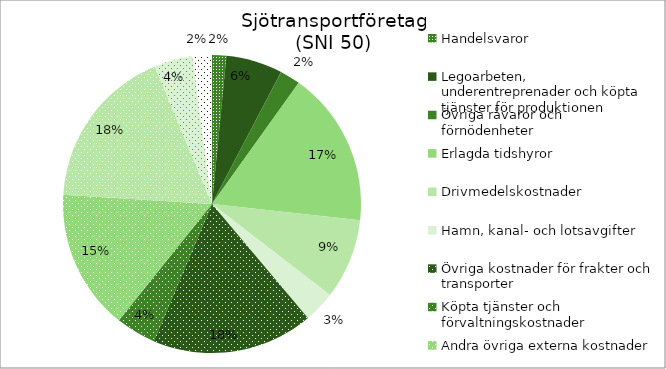
| Category | Series 0 |
|---|---|
| Handelsvaror | 533.984 |
| Legoarbeten, underentreprenader och köpta tjänster för produktionen | 2121.396 |
| Övriga råvaror och förnödenheter | 767.996 |
| Erlagda tidshyror | 5829.111 |
| Drivmedelskostnader | 3017.479 |
| Hamn, kanal- och lotsavgifter | 1179.908 |
| Övriga kostnader för frakter och transporter | 6064.676 |
| Köpta tjänster och förvaltningskostnader | 1505.86 |
| Andra övriga externa kostnader | 5276.789 |
| Personalkostnader | 6140.564 |
| Avskrivningar | 1438.508 |
| Övriga rörelsekostnader | 730.759 |